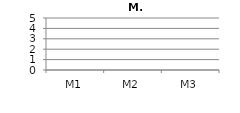
| Category | Gemiddelde |
|---|---|
| M1 | 0 |
| M2 | 0 |
| M3 | 0 |